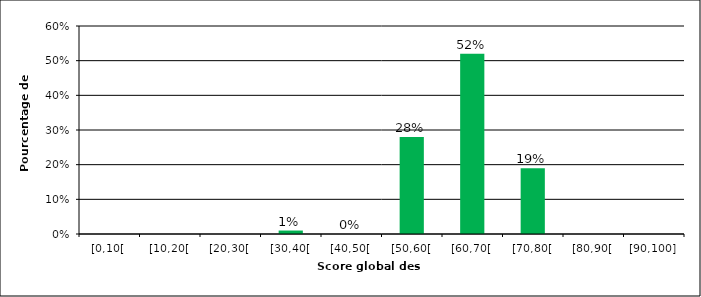
| Category | Series 0 | Series 1 |
|---|---|---|
| [0,10[ |  | 0 |
| [10,20[ |  | 0 |
| [20,30[ |  | 0 |
| [30,40[ |  | 0.01 |
| [40,50[ |  | 0 |
| [50,60[ |  | 0.28 |
| [60,70[ |  | 0.52 |
| [70,80[ |  | 0.19 |
| [80,90[ |  | 0 |
| [90,100] |  | 0 |